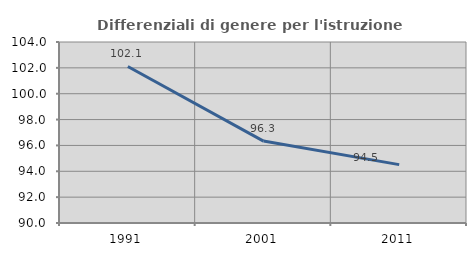
| Category | Differenziali di genere per l'istruzione superiore |
|---|---|
| 1991.0 | 102.107 |
| 2001.0 | 96.336 |
| 2011.0 | 94.514 |